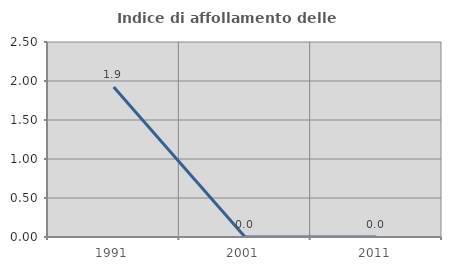
| Category | Indice di affollamento delle abitazioni  |
|---|---|
| 1991.0 | 1.923 |
| 2001.0 | 0 |
| 2011.0 | 0 |